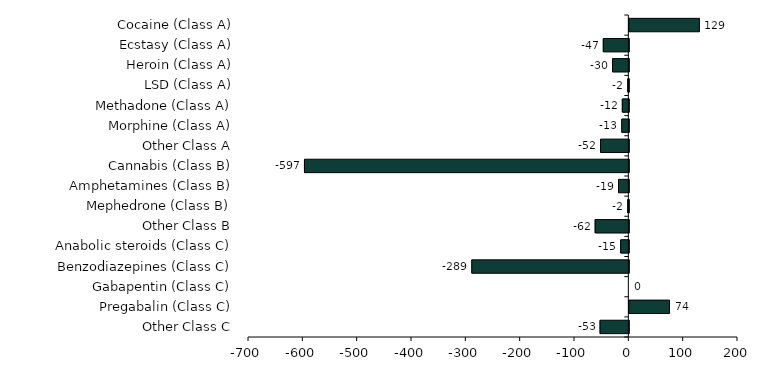
| Category | change |
|---|---|
| Cocaine (Class A) | 129 |
| Ecstasy (Class A) | -47 |
| Heroin (Class A) | -30 |
| LSD (Class A) | -2 |
| Methadone (Class A) | -12 |
| Morphine (Class A) | -13 |
| Other Class A | -52 |
| Cannabis (Class B) | -597 |
| Amphetamines (Class B) | -19 |
| Mephedrone (Class B) | -2 |
| Other Class B | -62 |
| Anabolic steroids (Class C) | -15 |
| Benzodiazepines (Class C) | -289 |
| Gabapentin (Class C) | 0 |
| Pregabalin (Class C) | 74 |
| Other Class C | -53 |